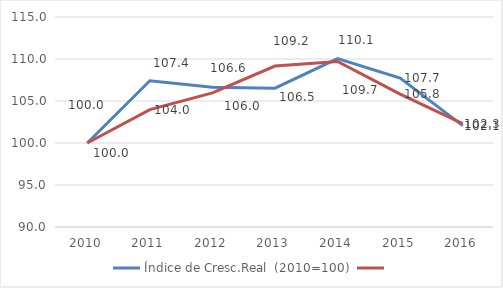
| Category | Índice de Cresc.Real  (2010=100) | Series 1 |
|---|---|---|
| 2010.0 | 100 | 100 |
| 2011.0 | 107.407 | 103.974 |
| 2012.0 | 106.623 | 105.972 |
| 2013.0 | 106.521 | 109.156 |
| 2014.0 | 110.051 | 109.706 |
| 2015.0 | 107.74 | 105.816 |
| 2016.0 | 102.07 | 102.319 |